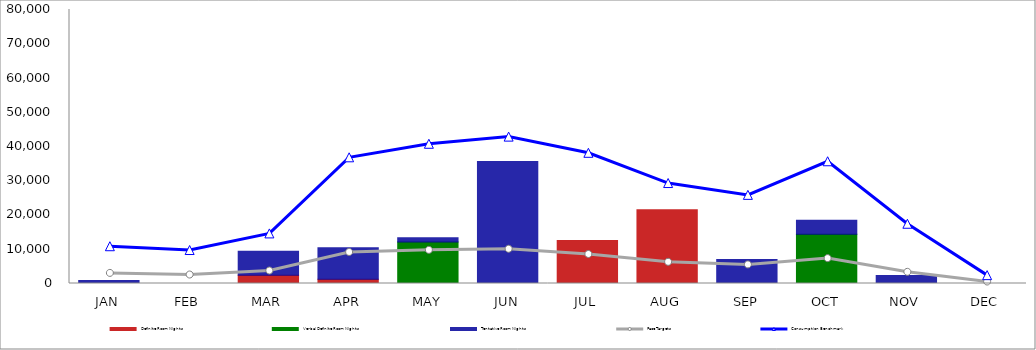
| Category | Definite Room Nights | Verbal Definite Room Nights | Tentative Room Nights |
|---|---|---|---|
| JAN | 0 | 0 | 910 |
| FEB | 0 | 0 | 0 |
| MAR | 2400 | 0 | 7000 |
| APR | 1205 | 0 | 9239 |
| MAY | 0 | 12090 | 1295 |
| JUN | 0 | 0 | 35595 |
| JUL | 12546 | 0 | 0 |
| AUG | 21550 | 0 | 0 |
| SEP | 0 | 0 | 6998 |
| OCT | 0 | 14355 | 4132 |
| NOV | 0 | 0 | 2316 |
| DEC | 0 | 0 | 0 |